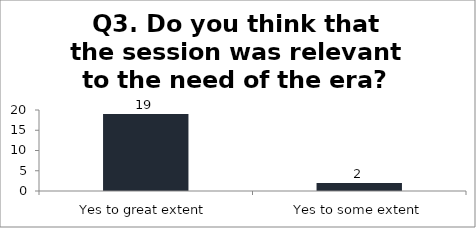
| Category | Q3. Do you think that the session was relevant to the need of the era? |
|---|---|
| Yes to great extent | 19 |
| Yes to some extent | 2 |